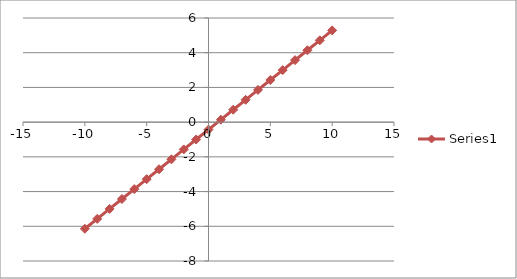
| Category | Series 0 |
|---|---|
| -10.0 | -6.143 |
| -9.0 | -5.571 |
| -8.0 | -5 |
| -7.0 | -4.429 |
| -6.0 | -3.857 |
| -5.0 | -3.286 |
| -4.0 | -2.714 |
| -3.0 | -2.143 |
| -2.0 | -1.571 |
| -1.0 | -1 |
| 0.0 | -0.429 |
| 1.0 | 0.143 |
| 2.0 | 0.714 |
| 3.0 | 1.286 |
| 4.0 | 1.857 |
| 5.0 | 2.429 |
| 6.0 | 3 |
| 7.0 | 3.571 |
| 8.0 | 4.143 |
| 9.0 | 4.714 |
| 10.0 | 5.286 |